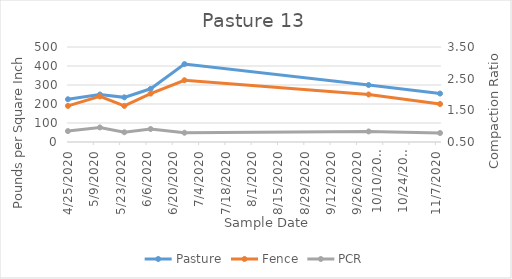
| Category | Pasture | Fence |
|---|---|---|
| 4/25/20 | 225 | 190 |
| 5/12/20 | 250 | 240 |
| 5/25/20 | 235 | 190 |
| 6/8/20 | 280 | 255 |
| 6/26/20 | 410 | 325 |
| 10/2/20 | 300 | 250 |
| 11/9/20 | 255 | 200 |